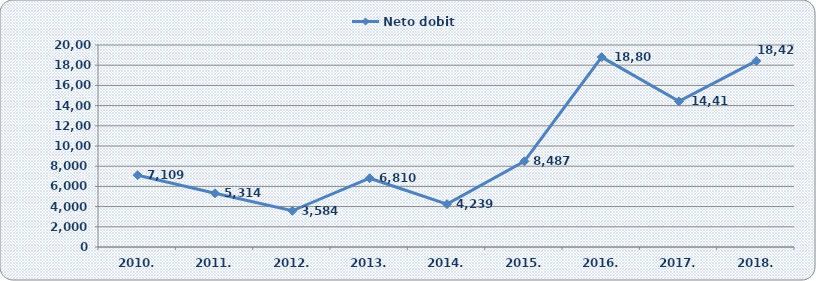
| Category | Neto dobit |
|---|---|
| 2010. | 7109 |
| 2011. | 5314 |
| 2012. | 3584 |
| 2013. | 6810 |
| 2014. | 4239 |
| 2015. | 8487 |
| 2016. | 18804 |
| 2017. | 14417.017 |
| 2018. | 18423.858 |